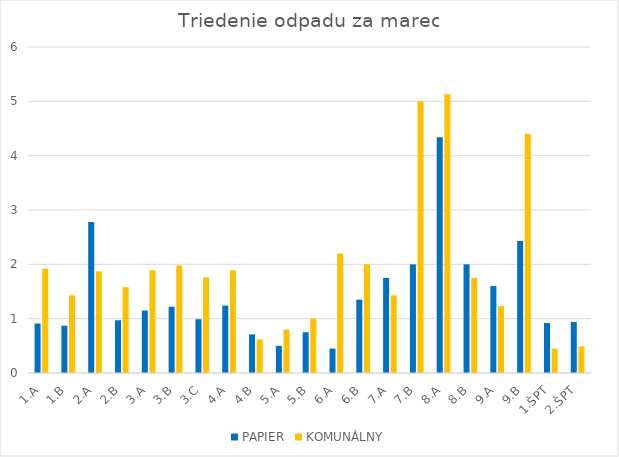
| Category | PAPIER | KOMUNÁLNY |
|---|---|---|
| 1.A | 0.91 | 1.92 |
| 1.B | 0.87 | 1.43 |
| 2.A | 2.78 | 1.87 |
| 2.B | 0.97 | 1.58 |
| 3.A | 1.15 | 1.89 |
| 3.B | 1.22 | 1.98 |
| 3.C | 0.99 | 1.76 |
| 4.A | 1.24 | 1.89 |
| 4.B | 0.71 | 0.62 |
| 5.A | 0.5 | 0.8 |
| 5.B | 0.75 | 1 |
| 6.A | 0.45 | 2.2 |
| 6.B | 1.35 | 2 |
| 7.A | 1.75 | 1.43 |
| 7.B | 2 | 5 |
| 8.A | 4.34 | 5.13 |
| 8.B | 2 | 1.75 |
| 9.A | 1.6 | 1.23 |
| 9.B | 2.43 | 4.4 |
| 1.ŠPT | 0.92 | 0.45 |
| 2.ŠPT | 0.94 | 0.49 |